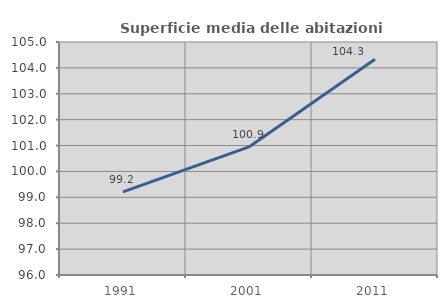
| Category | Superficie media delle abitazioni occupate |
|---|---|
| 1991.0 | 99.21 |
| 2001.0 | 100.946 |
| 2011.0 | 104.333 |